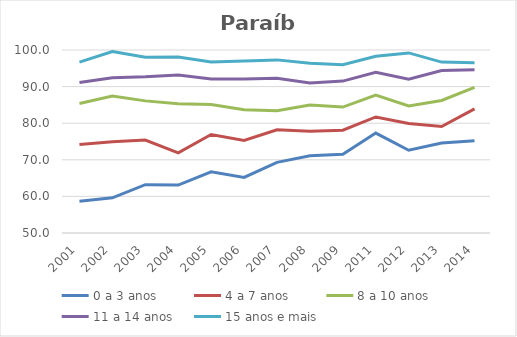
| Category | 0 a 3 anos | 4 a 7 anos | 8 a 10 anos | 11 a 14 anos | 15 anos e mais |
|---|---|---|---|---|---|
| 2001.0 | 58.7 | 74.2 | 85.4 | 91.1 | 96.7 |
| 2002.0 | 59.6 | 74.9 | 87.4 | 92.4 | 99.6 |
| 2003.0 | 63.2 | 75.4 | 86.1 | 92.7 | 98 |
| 2004.0 | 63.1 | 71.9 | 85.3 | 93.2 | 98.1 |
| 2005.0 | 66.7 | 76.9 | 85.1 | 92.1 | 96.7 |
| 2006.0 | 65.2 | 75.3 | 83.7 | 92.1 | 97 |
| 2007.0 | 69.3 | 78.2 | 83.4 | 92.3 | 97.3 |
| 2008.0 | 71.1 | 77.8 | 85 | 91 | 96.4 |
| 2009.0 | 71.5 | 78.1 | 84.4 | 91.5 | 96 |
| 2011.0 | 77.3 | 81.7 | 87.7 | 93.9 | 98.3 |
| 2012.0 | 72.6 | 79.9 | 84.7 | 92 | 99.2 |
| 2013.0 | 74.6 | 79.1 | 86.2 | 94.4 | 96.7 |
| 2014.0 | 75.2 | 83.9 | 89.8 | 94.6 | 96.5 |